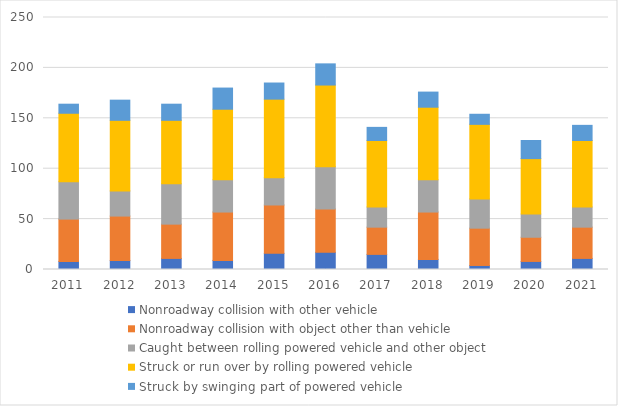
| Category | Nonroadway collision with other vehicle | Nonroadway collision with object other than vehicle | Caught between rolling powered vehicle and other object | Struck or run over by rolling powered vehicle | Struck by swinging part of powered vehicle |
|---|---|---|---|---|---|
| 2011 | 8 | 42 | 37 | 68 | 9 |
| 2012 | 9 | 44 | 25 | 70 | 20 |
| 2013 | 11 | 34 | 40 | 63 | 16 |
| 2014 | 9 | 48 | 32 | 70 | 21 |
| 2015 | 16 | 48 | 27 | 78 | 16 |
| 2016 | 17 | 43 | 42 | 81 | 21 |
| 2017 | 15 | 27 | 20 | 66 | 13 |
| 2018 | 10 | 47 | 32 | 72 | 15 |
| 2019 | 4 | 37 | 29 | 74 | 10 |
| 2020 | 8 | 24 | 23 | 55 | 18 |
| 2021 | 11 | 31 | 20 | 66 | 15 |